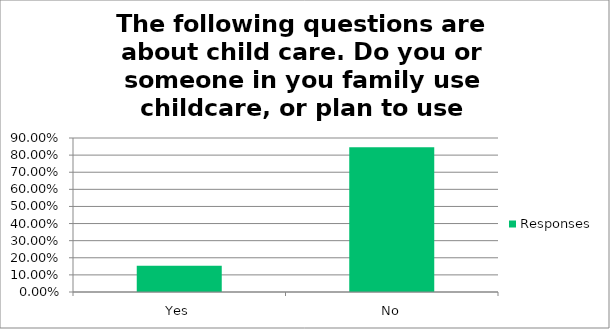
| Category | Responses |
|---|---|
| Yes | 0.154 |
| No | 0.846 |